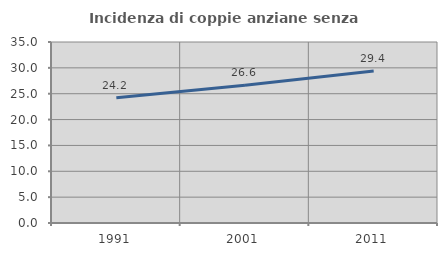
| Category | Incidenza di coppie anziane senza figli  |
|---|---|
| 1991.0 | 24.211 |
| 2001.0 | 26.623 |
| 2011.0 | 29.412 |